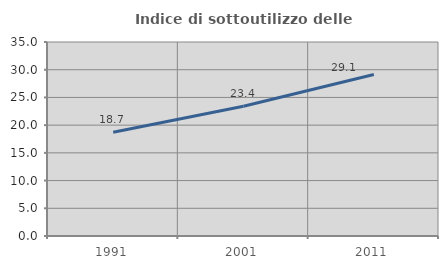
| Category | Indice di sottoutilizzo delle abitazioni  |
|---|---|
| 1991.0 | 18.724 |
| 2001.0 | 23.407 |
| 2011.0 | 29.146 |